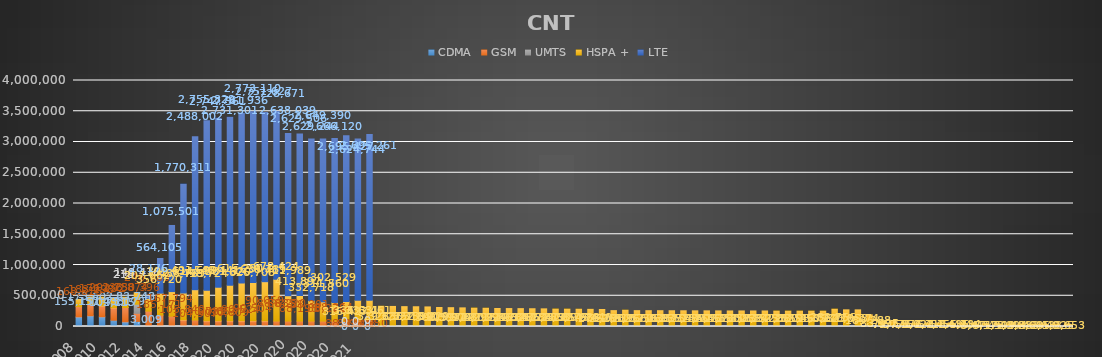
| Category | CDMA | GSM | UMTS | HSPA + | LTE |
|---|---|---|---|---|---|
| 2008 | 155151 | 168816 | 0 | 116162 | 0 |
| 2009 | 173602 | 183298 | 0 | 124298 | 0 |
| 2010 | 157438 | 176292 | 0 | 143876 | 0 |
| 2011 | 102115 | 201253 | 0 | 154224 | 0 |
| 2012 | 75179 | 233874 | 218 | 167677 | 0 |
| 2013 | 83748 | 130396 | 148416 | 186769 | 0 |
| 2014 | 3009 | 246983 | 0 | 207662 | 28176 |
| 2015 | 0 | 185171 | 0 | 356720 | 564105 |
| 2016 | 0 | 167794 | 0 | 399614 | 1075501 |
| 2017 | 0 | 105840 | 0 | 438789 | 1770311 |
| 2018 | 0 | 104907 | 0 | 491699 | 2488002 |
| 2019 | 0 | 90785 | 0 | 498724 | 2755329 |
| Ene 2020 | 0 | 90653 | 0 | 548441 | 2747561 |
| Feb 2020 | 0 | 90809 | 0 | 581320 | 2731301 |
| Mar 2020 | 0 | 90524 | 0 | 615250 | 2761936 |
| Abr 2020 | 0 | 90504 | 0 | 626708 | 2773110 |
| May 2020 | 0 | 90059 | 0 | 638789 | 2751627 |
| Jun 2020 | 0 | 88685 | 0 | 678424 | 2728671 |
| Jul 2020 | 0 | 88220 | 0 | 411989 | 2638039 |
| Ago 2020 | 0 | 88198 | 0 | 413897 | 2629506 |
| Sep 2020 | 0 | 88301 | 0 | 332718 | 2629244 |
| Oct 2020 | 0 | 88272 | 0 | 311560 | 2649390 |
| Nov 2020 | 0 | 88264 | 0 | 302529 | 2666120 |
| Dic 2020 | 0 | 88328 | 0 | 316427 | 2695427 |
| Ene 2021 | 0 | 88508 | 0 | 336631 | 2624744 |
| Feb 2021 | 0 | 93850 | 0 | 333461 | 2695261 |